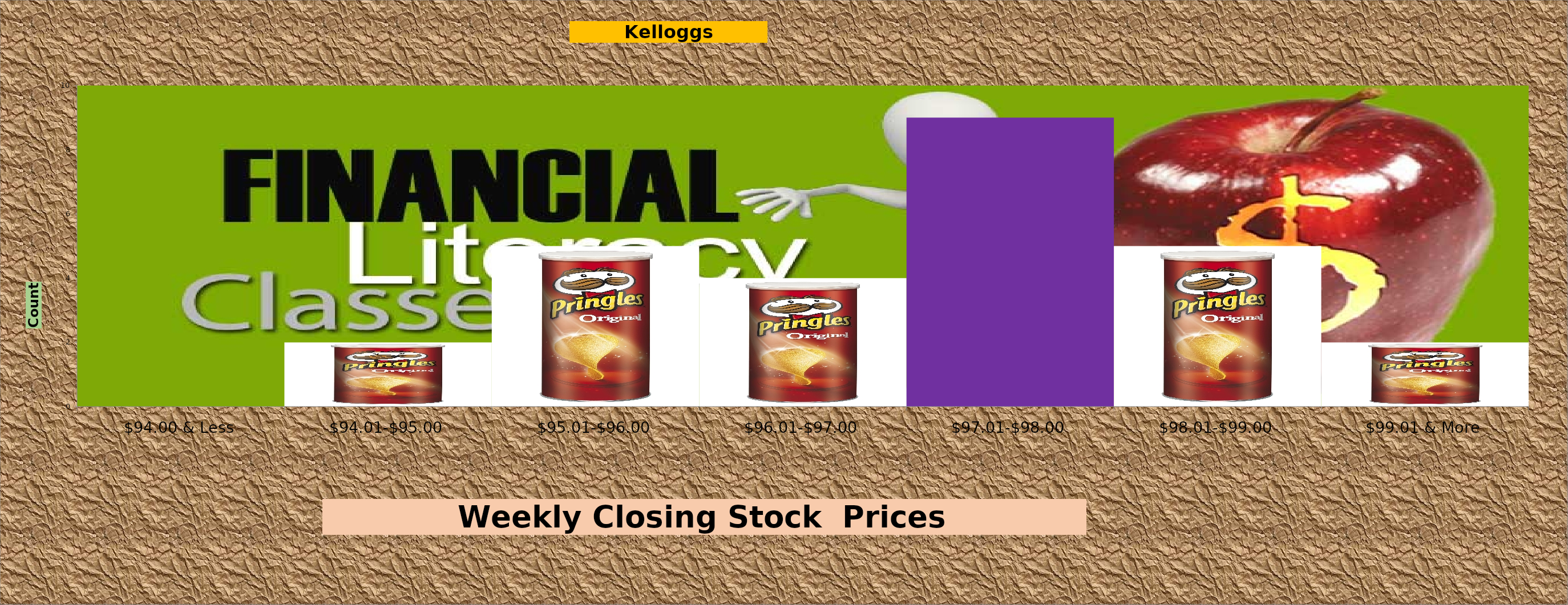
| Category | Frequency |
|---|---|
| $94.00 & Less | 0 |
| $94.01-$95.00 | 2 |
| $95.01-$96.00 | 5 |
| $96.01-$97.00 | 4 |
| $97.01-$98.00 | 9 |
| $98.01-$99.00 | 5 |
| $99.01 & More | 2 |